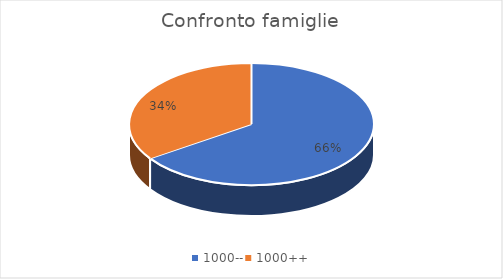
| Category | Series 0 |
|---|---|
| 1000-- | 114 |
| 1000++ | 60 |